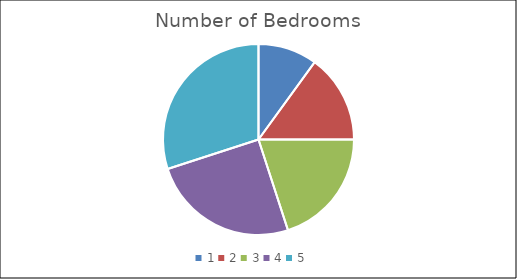
| Category | Series 0 | Series 1 |
|---|---|---|
| 0 | 2 | 3 |
| 1 | 3 | 62 |
| 2 | 4 | 30 |
| 3 | 5 | 3 |
| 4 | 6 | 1 |